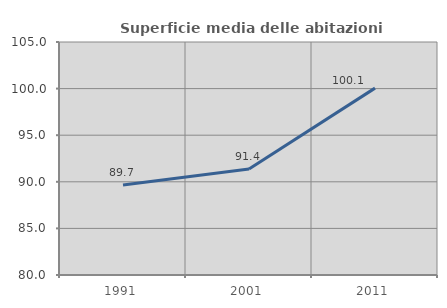
| Category | Superficie media delle abitazioni occupate |
|---|---|
| 1991.0 | 89.659 |
| 2001.0 | 91.365 |
| 2011.0 | 100.052 |